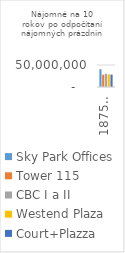
| Category | Sky Park Offices | Tower 115 | CBC I a II | Westend Plaza | Court+Plazza |
|---|---|---|---|---|---|
| 18756,44 m2 | 40364563.8 | 27927044.266 | 29777724.144 | 28615780.742 | 28334980.742 |